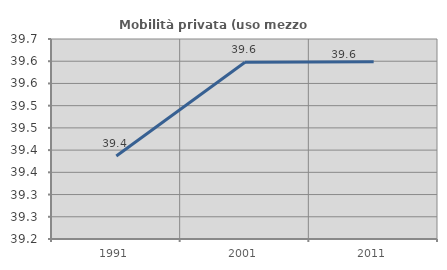
| Category | Mobilità privata (uso mezzo privato) |
|---|---|
| 1991.0 | 39.387 |
| 2001.0 | 39.598 |
| 2011.0 | 39.599 |